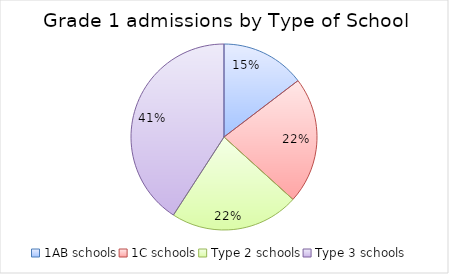
| Category | Series 0 |
|---|---|
| 1AB schools | 48102 |
| 1C schools | 72538 |
| Type 2 schools | 73754 |
| Type 3 schools | 134238 |